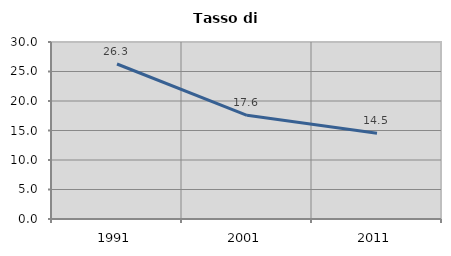
| Category | Tasso di disoccupazione   |
|---|---|
| 1991.0 | 26.271 |
| 2001.0 | 17.568 |
| 2011.0 | 14.537 |